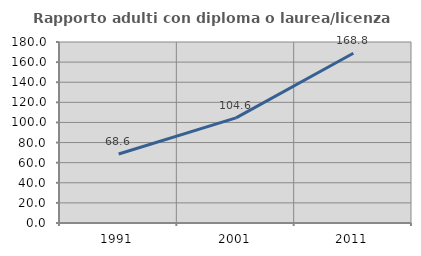
| Category | Rapporto adulti con diploma o laurea/licenza media  |
|---|---|
| 1991.0 | 68.585 |
| 2001.0 | 104.604 |
| 2011.0 | 168.785 |